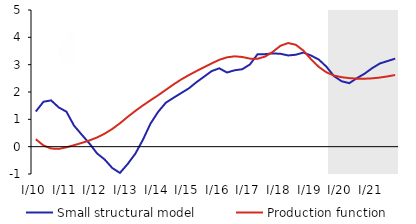
| Category | Small structural model | Production function |
|---|---|---|
| I/10 | 1.287 | 0.271 |
| II | 1.644 | 0.044 |
| III | 1.693 | -0.068 |
| IV | 1.435 | -0.081 |
| I/11 | 1.281 | -0.024 |
| II | 0.769 | 0.054 |
| III | 0.44 | 0.136 |
| IV | 0.121 | 0.227 |
| I/12 | -0.245 | 0.336 |
| II | -0.468 | 0.476 |
| III | -0.782 | 0.648 |
| IV | -0.96 | 0.855 |
| I/13 | -0.639 | 1.087 |
| II | -0.264 | 1.305 |
| III | 0.249 | 1.507 |
| IV | 0.844 | 1.697 |
| I/14 | 1.275 | 1.881 |
| II | 1.607 | 2.078 |
| III | 1.787 | 2.275 |
| IV | 1.959 | 2.456 |
| I/15 | 2.13 | 2.616 |
| II | 2.356 | 2.764 |
| III | 2.56 | 2.907 |
| IV | 2.765 | 3.048 |
| I/16 | 2.867 | 3.177 |
| II | 2.713 | 3.268 |
| III | 2.795 | 3.305 |
| IV | 2.833 | 3.281 |
| I/17 | 3.008 | 3.221 |
| II | 3.38 | 3.216 |
| III | 3.386 | 3.297 |
| IV | 3.412 | 3.47 |
| I/18 | 3.398 | 3.692 |
| II | 3.337 | 3.791 |
| III | 3.363 | 3.728 |
| IV | 3.443 | 3.513 |
| I/19 | 3.333 | 3.196 |
| II | 3.189 | 2.92 |
| III | 2.927 | 2.722 |
| IV | 2.579 | 2.601 |
| I/20 | 2.392 | 2.542 |
| II | 2.322 | 2.508 |
| III | 2.507 | 2.489 |
| IV | 2.671 | 2.486 |
| I/21 | 2.874 | 2.5 |
| II | 3.044 | 2.529 |
| III | 3.132 | 2.571 |
| IV | 3.221 | 2.622 |